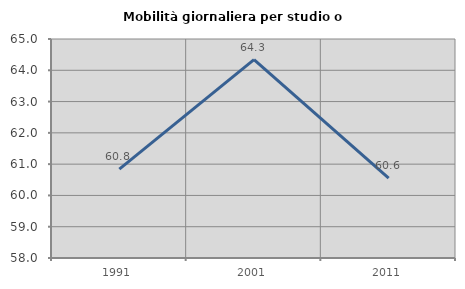
| Category | Mobilità giornaliera per studio o lavoro |
|---|---|
| 1991.0 | 60.839 |
| 2001.0 | 64.341 |
| 2011.0 | 60.553 |